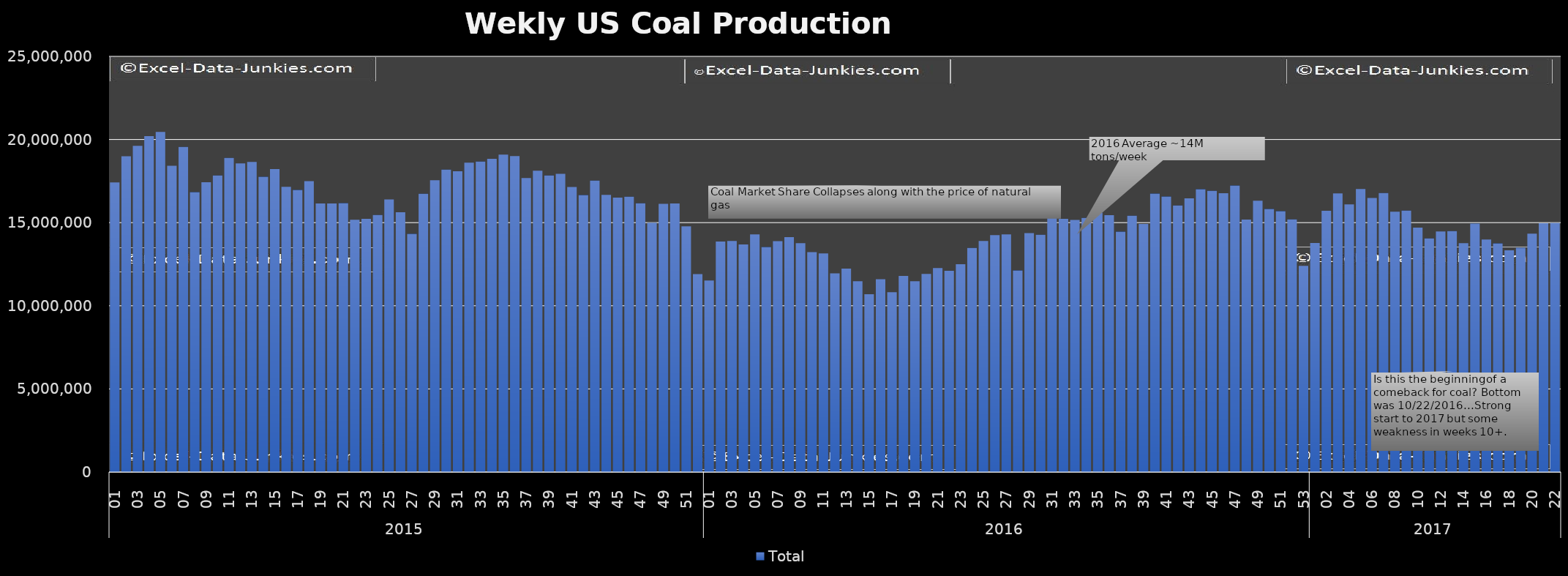
| Category | Total |
|---|---|
| 0 | 17413517 |
| 1 | 18995312 |
| 2 | 19614168 |
| 3 | 20207403 |
| 4 | 20456994 |
| 5 | 18425052 |
| 6 | 19554973 |
| 7 | 16831645 |
| 8 | 17431556 |
| 9 | 17837211 |
| 10 | 18889719 |
| 11 | 18564117 |
| 12 | 18651155 |
| 13 | 17755513 |
| 14 | 18222904 |
| 15 | 17152371 |
| 16 | 16966677 |
| 17 | 17499451 |
| 18 | 16153895 |
| 19 | 16149229 |
| 20 | 16171995 |
| 21 | 15176980 |
| 22 | 15232332 |
| 23 | 15464754 |
| 24 | 16395992 |
| 25 | 15630276 |
| 26 | 14321822 |
| 27 | 16736425 |
| 28 | 17554096 |
| 29 | 18188490 |
| 30 | 18085085 |
| 31 | 18605862 |
| 32 | 18671530 |
| 33 | 18835506 |
| 34 | 19087656 |
| 35 | 18999693 |
| 36 | 17679059 |
| 37 | 18128084 |
| 38 | 17832559 |
| 39 | 17937623 |
| 40 | 17144687 |
| 41 | 16655384 |
| 42 | 17525704 |
| 43 | 16667888 |
| 44 | 16507981 |
| 45 | 16563431 |
| 46 | 16164537 |
| 47 | 14981888 |
| 48 | 16133581 |
| 49 | 16153395 |
| 50 | 14778009 |
| 51 | 11906484 |
| 52 | 11522975 |
| 53 | 13864617 |
| 54 | 13900787 |
| 55 | 13683012 |
| 56 | 14289896 |
| 57 | 13529795 |
| 58 | 13889905 |
| 59 | 14133933 |
| 60 | 13761264 |
| 61 | 13229092 |
| 62 | 13146395 |
| 63 | 11952676 |
| 64 | 12234557 |
| 65 | 11479251 |
| 66 | 10695400 |
| 67 | 11600814 |
| 68 | 10818789 |
| 69 | 11794809 |
| 70 | 11472821 |
| 71 | 11915250 |
| 72 | 12266275 |
| 73 | 12105008 |
| 74 | 12505123 |
| 75 | 13474338 |
| 76 | 13902209 |
| 77 | 14253064 |
| 78 | 14295685 |
| 79 | 12123883 |
| 80 | 14374202 |
| 81 | 14272723 |
| 82 | 15407522 |
| 83 | 15233532 |
| 84 | 15164456 |
| 85 | 15282833 |
| 86 | 15601791 |
| 87 | 15449321 |
| 88 | 14459043 |
| 89 | 15414177 |
| 90 | 14922429 |
| 91 | 16744380 |
| 92 | 16568116 |
| 93 | 16030041 |
| 94 | 16461774 |
| 95 | 17007882 |
| 96 | 16909755 |
| 97 | 16770246 |
| 98 | 17231886 |
| 99 | 15190273 |
| 100 | 16316824 |
| 101 | 15818055 |
| 102 | 15688576 |
| 103 | 15201364 |
| 104 | 12398584 |
| 105 | 13775763 |
| 106 | 15715747 |
| 107 | 16759296 |
| 108 | 16098787 |
| 109 | 17024378 |
| 110 | 16488293 |
| 111 | 16785302 |
| 112 | 15658310 |
| 113 | 15724953 |
| 114 | 14702807 |
| 115 | 14050129 |
| 116 | 14468963 |
| 117 | 14492638 |
| 118 | 13765211 |
| 119 | 14937533 |
| 120 | 13985349 |
| 121 | 13753124 |
| 122 | 13331578 |
| 123 | 13490288 |
| 124 | 14339266 |
| 125 | 14969406 |
| 126 | 14974311 |